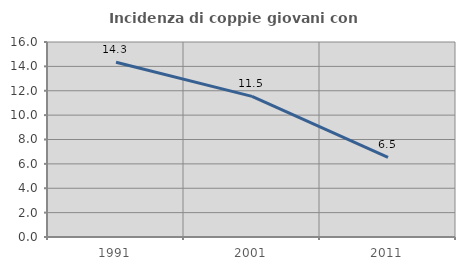
| Category | Incidenza di coppie giovani con figli |
|---|---|
| 1991.0 | 14.332 |
| 2001.0 | 11.541 |
| 2011.0 | 6.54 |